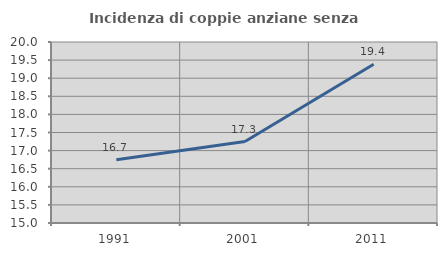
| Category | Incidenza di coppie anziane senza figli  |
|---|---|
| 1991.0 | 16.745 |
| 2001.0 | 17.251 |
| 2011.0 | 19.385 |